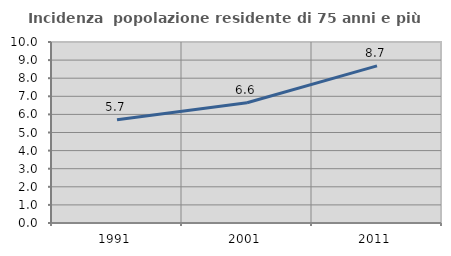
| Category | Incidenza  popolazione residente di 75 anni e più |
|---|---|
| 1991.0 | 5.701 |
| 2001.0 | 6.647 |
| 2011.0 | 8.679 |